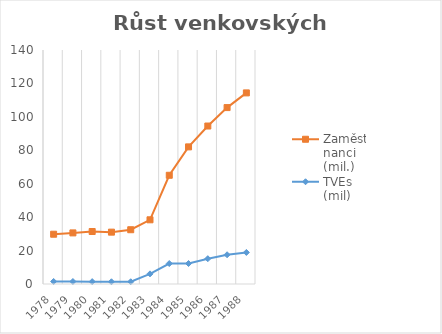
| Category | TVEs (mil) | Zaměstnanci (mil.) |
|---|---|---|
| 1978.0 | 1.52 | 28.26 |
| 1979.0 | 1.48 | 29.09 |
| 1980.0 | 1.42 | 29.99 |
| 1981.0 | 1.33 | 29.69 |
| 1982.0 | 1.34 | 31.13 |
| 1983.0 | 6.06 | 32.35 |
| 1984.0 | 12.25 | 52.8 |
| 1985.0 | 12.25 | 69.79 |
| 1986.0 | 15.15 | 79.37 |
| 1987.0 | 17.5 | 88.05 |
| 1988.0 | 18.88 | 95.45 |